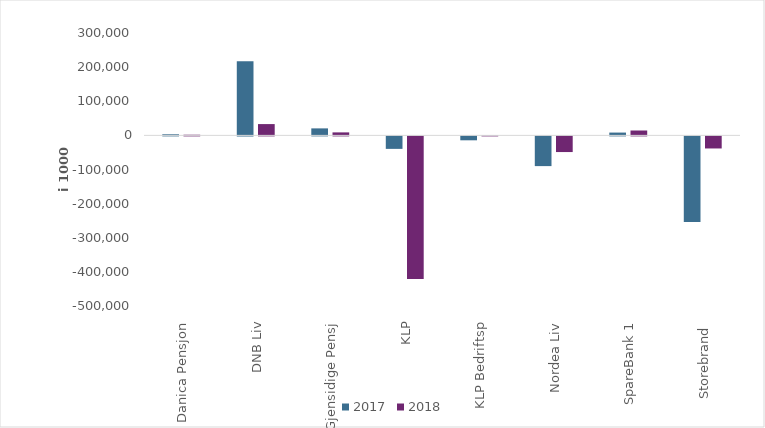
| Category | 2017 | 2018 |
|---|---|---|
| Danica Pensjon | 3232.74 | 1918.378 |
| DNB Liv | 217490 | 33099 |
| Gjensidige Pensj | 20501 | 8758 |
| KLP | -36647.545 | -418198.021 |
| KLP Bedriftsp | -11503 | 163 |
| Nordea Liv | -87133.885 | -45945.832 |
| SpareBank 1 | 8216.9 | 14295.353 |
| Storebrand  | -251182.724 | -35442.452 |